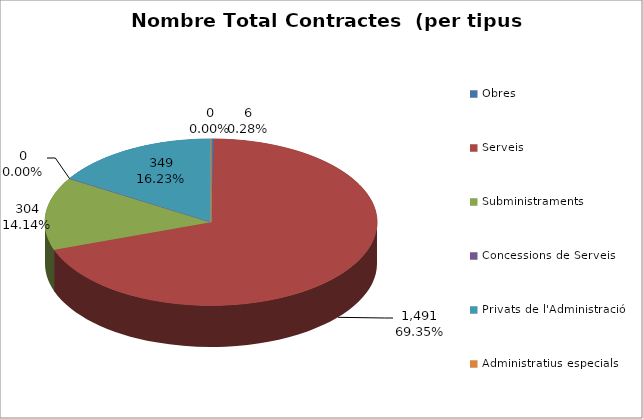
| Category | Nombre Total Contractes |
|---|---|
| Obres | 6 |
| Serveis | 1491 |
| Subministraments | 304 |
| Concessions de Serveis | 0 |
| Privats de l'Administració | 349 |
| Administratius especials | 0 |